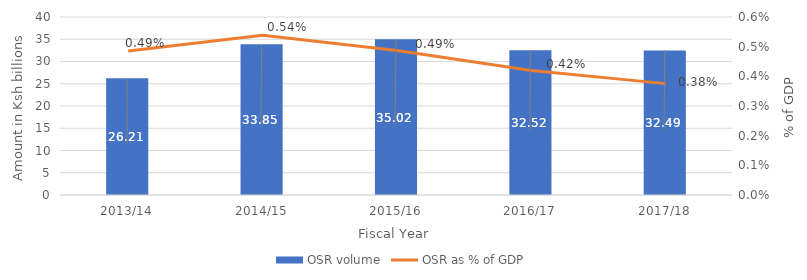
| Category | OSR volume |
|---|---|
| 2013/14 | 26212.4 |
| 2014/15 | 33848.542 |
| 2015/16 | 35021.571 |
| 2016/17 | 32522.875 |
| 2017/18 | 32491.694 |